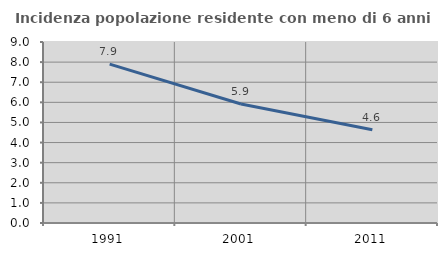
| Category | Incidenza popolazione residente con meno di 6 anni |
|---|---|
| 1991.0 | 7.897 |
| 2001.0 | 5.917 |
| 2011.0 | 4.633 |